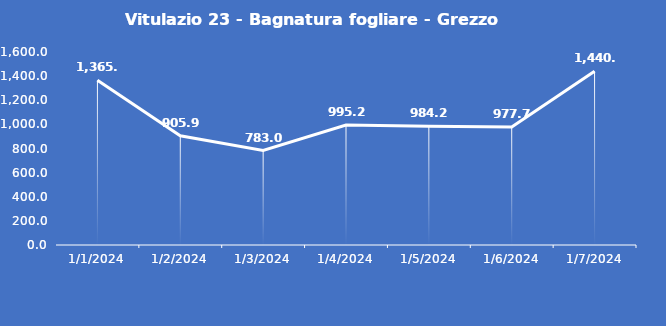
| Category | Vitulazio 23 - Bagnatura fogliare - Grezzo (min) |
|---|---|
| 1/1/24 | 1365.5 |
| 1/2/24 | 905.9 |
| 1/3/24 | 783 |
| 1/4/24 | 995.2 |
| 1/5/24 | 984.2 |
| 1/6/24 | 977.7 |
| 1/7/24 | 1440 |